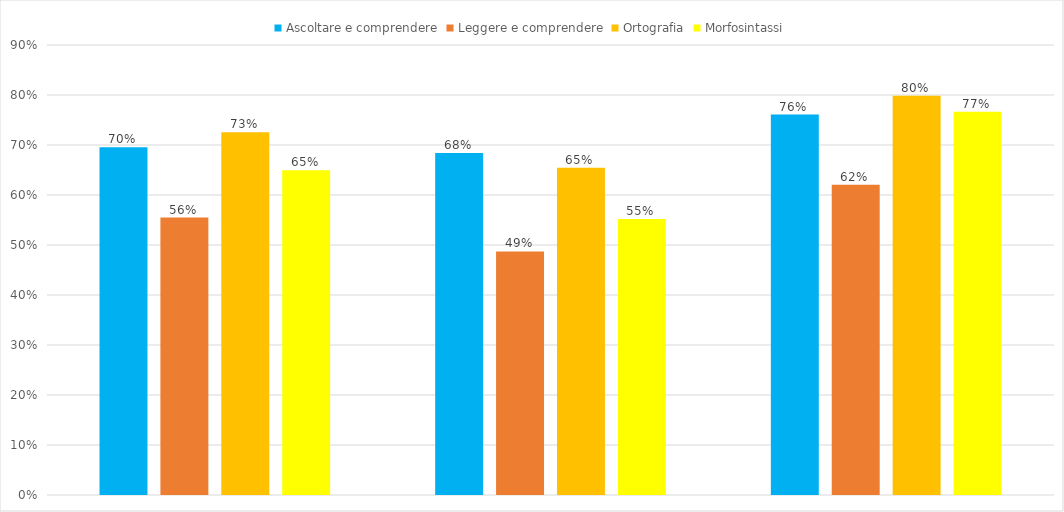
| Category | Ascoltare e comprendere | Leggere e comprendere | Ortografia | Morfosintassi |
|---|---|---|---|---|
| 2A Vivaldi | 0.696 | 0.555 | 0.726 | 0.649 |
| 2B Vivaldi | 0.684 | 0.487 | 0.655 | 0.552 |
| 2C Vivaldi | 0.761 | 0.62 | 0.798 | 0.766 |